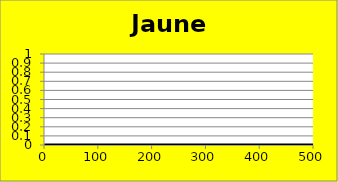
| Category | Jaune Cum |
|---|---|
| 0 | 0 |
| 1 | 0 |
| 2 | 0 |
| 3 | 0 |
| 4 | 0 |
| 5 | 0 |
| 6 | 0 |
| 7 | 0 |
| 8 | 0 |
| 9 | 0 |
| 10 | 0 |
| 11 | 0 |
| 12 | 0 |
| 13 | 0 |
| 14 | 0 |
| 15 | 0 |
| 16 | 0 |
| 17 | 0 |
| 18 | 0 |
| 19 | 0 |
| 20 | 0 |
| 21 | 0 |
| 22 | 0 |
| 23 | 0 |
| 24 | 0 |
| 25 | 0 |
| 26 | 0 |
| 27 | 0 |
| 28 | 0 |
| 29 | 0 |
| 30 | 0 |
| 31 | 0 |
| 32 | 0 |
| 33 | 0 |
| 34 | 0 |
| 35 | 0 |
| 36 | 0 |
| 37 | 0 |
| 38 | 0 |
| 39 | 0 |
| 40 | 0 |
| 41 | 0 |
| 42 | 0 |
| 43 | 0 |
| 44 | 0 |
| 45 | 0 |
| 46 | 0 |
| 47 | 0 |
| 48 | 0 |
| 49 | 0 |
| 50 | 0 |
| 51 | 0 |
| 52 | 0 |
| 53 | 0 |
| 54 | 0 |
| 55 | 0 |
| 56 | 0 |
| 57 | 0 |
| 58 | 0 |
| 59 | 0 |
| 60 | 0 |
| 61 | 0 |
| 62 | 0 |
| 63 | 0 |
| 64 | 0 |
| 65 | 0 |
| 66 | 0 |
| 67 | 0 |
| 68 | 0 |
| 69 | 0 |
| 70 | 0 |
| 71 | 0 |
| 72 | 0 |
| 73 | 0 |
| 74 | 0 |
| 75 | 0 |
| 76 | 0 |
| 77 | 0 |
| 78 | 0 |
| 79 | 0 |
| 80 | 0 |
| 81 | 0 |
| 82 | 0 |
| 83 | 0 |
| 84 | 0 |
| 85 | 0 |
| 86 | 0 |
| 87 | 0 |
| 88 | 0 |
| 89 | 0 |
| 90 | 0 |
| 91 | 0 |
| 92 | 0 |
| 93 | 0 |
| 94 | 0 |
| 95 | 0 |
| 96 | 0 |
| 97 | 0 |
| 98 | 0 |
| 99 | 0 |
| 100 | 0 |
| 101 | 0 |
| 102 | 0 |
| 103 | 0 |
| 104 | 0 |
| 105 | 0 |
| 106 | 0 |
| 107 | 0 |
| 108 | 0 |
| 109 | 0 |
| 110 | 0 |
| 111 | 0 |
| 112 | 0 |
| 113 | 0 |
| 114 | 0 |
| 115 | 0 |
| 116 | 0 |
| 117 | 0 |
| 118 | 0 |
| 119 | 0 |
| 120 | 0 |
| 121 | 0 |
| 122 | 0 |
| 123 | 0 |
| 124 | 0 |
| 125 | 0 |
| 126 | 0 |
| 127 | 0 |
| 128 | 0 |
| 129 | 0 |
| 130 | 0 |
| 131 | 0 |
| 132 | 0 |
| 133 | 0 |
| 134 | 0 |
| 135 | 0 |
| 136 | 0 |
| 137 | 0 |
| 138 | 0 |
| 139 | 0 |
| 140 | 0 |
| 141 | 0 |
| 142 | 0 |
| 143 | 0 |
| 144 | 0 |
| 145 | 0 |
| 146 | 0 |
| 147 | 0 |
| 148 | 0 |
| 149 | 0 |
| 150 | 0 |
| 151 | 0 |
| 152 | 0 |
| 153 | 0 |
| 154 | 0 |
| 155 | 0 |
| 156 | 0 |
| 157 | 0 |
| 158 | 0 |
| 159 | 0 |
| 160 | 0 |
| 161 | 0 |
| 162 | 0 |
| 163 | 0 |
| 164 | 0 |
| 165 | 0 |
| 166 | 0 |
| 167 | 0 |
| 168 | 0 |
| 169 | 0 |
| 170 | 0 |
| 171 | 0 |
| 172 | 0 |
| 173 | 0 |
| 174 | 0 |
| 175 | 0 |
| 176 | 0 |
| 177 | 0 |
| 178 | 0 |
| 179 | 0 |
| 180 | 0 |
| 181 | 0 |
| 182 | 0 |
| 183 | 0 |
| 184 | 0 |
| 185 | 0 |
| 186 | 0 |
| 187 | 0 |
| 188 | 0 |
| 189 | 0 |
| 190 | 0 |
| 191 | 0 |
| 192 | 0 |
| 193 | 0 |
| 194 | 0 |
| 195 | 0 |
| 196 | 0 |
| 197 | 0 |
| 198 | 0 |
| 199 | 0 |
| 200 | 0 |
| 201 | 0 |
| 202 | 0 |
| 203 | 0 |
| 204 | 0 |
| 205 | 0 |
| 206 | 0 |
| 207 | 0 |
| 208 | 0 |
| 209 | 0 |
| 210 | 0 |
| 211 | 0 |
| 212 | 0 |
| 213 | 0 |
| 214 | 0 |
| 215 | 0 |
| 216 | 0 |
| 217 | 0 |
| 218 | 0 |
| 219 | 0 |
| 220 | 0 |
| 221 | 0 |
| 222 | 0 |
| 223 | 0 |
| 224 | 0 |
| 225 | 0 |
| 226 | 0 |
| 227 | 0 |
| 228 | 0 |
| 229 | 0 |
| 230 | 0 |
| 231 | 0 |
| 232 | 0 |
| 233 | 0 |
| 234 | 0 |
| 235 | 0 |
| 236 | 0 |
| 237 | 0 |
| 238 | 0 |
| 239 | 0 |
| 240 | 0 |
| 241 | 0 |
| 242 | 0 |
| 243 | 0 |
| 244 | 0 |
| 245 | 0 |
| 246 | 0 |
| 247 | 0 |
| 248 | 0 |
| 249 | 0 |
| 250 | 0 |
| 251 | 0 |
| 252 | 0 |
| 253 | 0 |
| 254 | 0 |
| 255 | 0 |
| 256 | 0 |
| 257 | 0 |
| 258 | 0 |
| 259 | 0 |
| 260 | 0 |
| 261 | 0 |
| 262 | 0 |
| 263 | 0 |
| 264 | 0 |
| 265 | 0 |
| 266 | 0 |
| 267 | 0 |
| 268 | 0 |
| 269 | 0 |
| 270 | 0 |
| 271 | 0 |
| 272 | 0 |
| 273 | 0 |
| 274 | 0 |
| 275 | 0 |
| 276 | 0 |
| 277 | 0 |
| 278 | 0 |
| 279 | 0 |
| 280 | 0 |
| 281 | 0 |
| 282 | 0 |
| 283 | 0 |
| 284 | 0 |
| 285 | 0 |
| 286 | 0 |
| 287 | 0 |
| 288 | 0 |
| 289 | 0 |
| 290 | 0 |
| 291 | 0 |
| 292 | 0 |
| 293 | 0 |
| 294 | 0 |
| 295 | 0 |
| 296 | 0 |
| 297 | 0 |
| 298 | 0 |
| 299 | 0 |
| 300 | 0 |
| 301 | 0 |
| 302 | 0 |
| 303 | 0 |
| 304 | 0 |
| 305 | 0 |
| 306 | 0 |
| 307 | 0 |
| 308 | 0 |
| 309 | 0 |
| 310 | 0 |
| 311 | 0 |
| 312 | 0 |
| 313 | 0 |
| 314 | 0 |
| 315 | 0 |
| 316 | 0 |
| 317 | 0 |
| 318 | 0 |
| 319 | 0 |
| 320 | 0 |
| 321 | 0 |
| 322 | 0 |
| 323 | 0 |
| 324 | 0 |
| 325 | 0 |
| 326 | 0 |
| 327 | 0 |
| 328 | 0 |
| 329 | 0 |
| 330 | 0 |
| 331 | 0 |
| 332 | 0 |
| 333 | 0 |
| 334 | 0 |
| 335 | 0 |
| 336 | 0 |
| 337 | 0 |
| 338 | 0 |
| 339 | 0 |
| 340 | 0 |
| 341 | 0 |
| 342 | 0 |
| 343 | 0 |
| 344 | 0 |
| 345 | 0 |
| 346 | 0 |
| 347 | 0 |
| 348 | 0 |
| 349 | 0 |
| 350 | 0 |
| 351 | 0 |
| 352 | 0 |
| 353 | 0 |
| 354 | 0 |
| 355 | 0 |
| 356 | 0 |
| 357 | 0 |
| 358 | 0 |
| 359 | 0 |
| 360 | 0 |
| 361 | 0 |
| 362 | 0 |
| 363 | 0 |
| 364 | 0 |
| 365 | 0 |
| 366 | 0 |
| 367 | 0 |
| 368 | 0 |
| 369 | 0 |
| 370 | 0 |
| 371 | 0 |
| 372 | 0 |
| 373 | 0 |
| 374 | 0 |
| 375 | 0 |
| 376 | 0 |
| 377 | 0 |
| 378 | 0 |
| 379 | 0 |
| 380 | 0 |
| 381 | 0 |
| 382 | 0 |
| 383 | 0 |
| 384 | 0 |
| 385 | 0 |
| 386 | 0 |
| 387 | 0 |
| 388 | 0 |
| 389 | 0 |
| 390 | 0 |
| 391 | 0 |
| 392 | 0 |
| 393 | 0 |
| 394 | 0 |
| 395 | 0 |
| 396 | 0 |
| 397 | 0 |
| 398 | 0 |
| 399 | 0 |
| 400 | 0 |
| 401 | 0 |
| 402 | 0 |
| 403 | 0 |
| 404 | 0 |
| 405 | 0 |
| 406 | 0 |
| 407 | 0 |
| 408 | 0 |
| 409 | 0 |
| 410 | 0 |
| 411 | 0 |
| 412 | 0 |
| 413 | 0 |
| 414 | 0 |
| 415 | 0 |
| 416 | 0 |
| 417 | 0 |
| 418 | 0 |
| 419 | 0 |
| 420 | 0 |
| 421 | 0 |
| 422 | 0 |
| 423 | 0 |
| 424 | 0 |
| 425 | 0 |
| 426 | 0 |
| 427 | 0 |
| 428 | 0 |
| 429 | 0 |
| 430 | 0 |
| 431 | 0 |
| 432 | 0 |
| 433 | 0 |
| 434 | 0 |
| 435 | 0 |
| 436 | 0 |
| 437 | 0 |
| 438 | 0 |
| 439 | 0 |
| 440 | 0 |
| 441 | 0 |
| 442 | 0 |
| 443 | 0 |
| 444 | 0 |
| 445 | 0 |
| 446 | 0 |
| 447 | 0 |
| 448 | 0 |
| 449 | 0 |
| 450 | 0 |
| 451 | 0 |
| 452 | 0 |
| 453 | 0 |
| 454 | 0 |
| 455 | 0 |
| 456 | 0 |
| 457 | 0 |
| 458 | 0 |
| 459 | 0 |
| 460 | 0 |
| 461 | 0 |
| 462 | 0 |
| 463 | 0 |
| 464 | 0 |
| 465 | 0 |
| 466 | 0 |
| 467 | 0 |
| 468 | 0 |
| 469 | 0 |
| 470 | 0 |
| 471 | 0 |
| 472 | 0 |
| 473 | 0 |
| 474 | 0 |
| 475 | 0 |
| 476 | 0 |
| 477 | 0 |
| 478 | 0 |
| 479 | 0 |
| 480 | 0 |
| 481 | 0 |
| 482 | 0 |
| 483 | 0 |
| 484 | 0 |
| 485 | 0 |
| 486 | 0 |
| 487 | 0 |
| 488 | 0 |
| 489 | 0 |
| 490 | 0 |
| 491 | 0 |
| 492 | 0 |
| 493 | 0 |
| 494 | 0 |
| 495 | 0 |
| 496 | 0 |
| 497 | 0 |
| 498 | 0 |
| 499 | 0 |